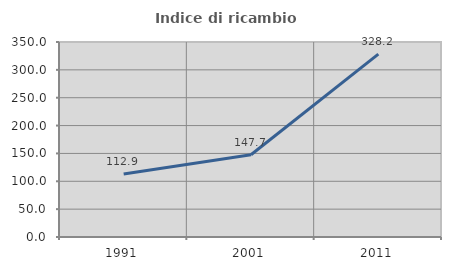
| Category | Indice di ricambio occupazionale  |
|---|---|
| 1991.0 | 112.9 |
| 2001.0 | 147.679 |
| 2011.0 | 328.199 |